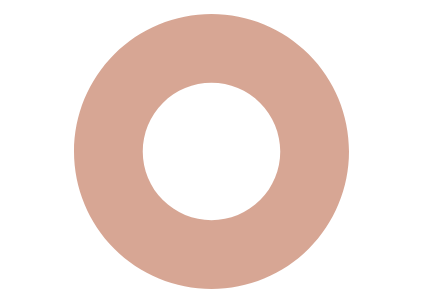
| Category | Series 0 |
|---|---|
| 0 | 1 |
| 1 | 0 |